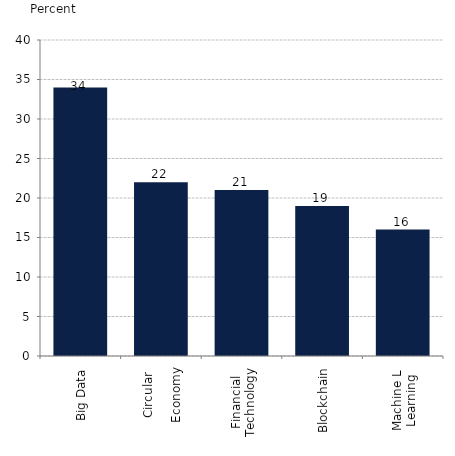
| Category | Impact of a 10% improvement in data usability on productivity (sales per employee) |
|---|---|
| Big Data | 34 |
| Circular

Economy | 22 |
| Financial
Technology | 21 |
| Blockchain | 19 |
| Machine L
Learning | 16 |